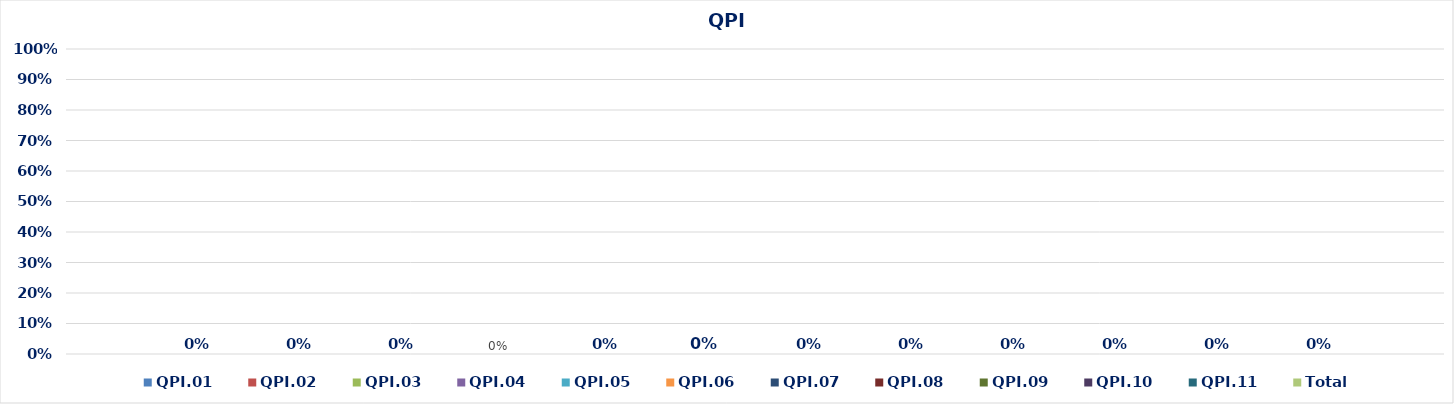
| Category | QPI.01 | QPI.02 | QPI.03 | QPI.04 | QPI.05 | QPI.06 | QPI.07 | QPI.08 | QPI.09 | QPI.10 | QPI.11 | Total |
|---|---|---|---|---|---|---|---|---|---|---|---|---|
| 0 | 0 | 0 | 0 | 0 | 0 | 0 | 0 | 0 | 0 | 0 | 0 | 0 |